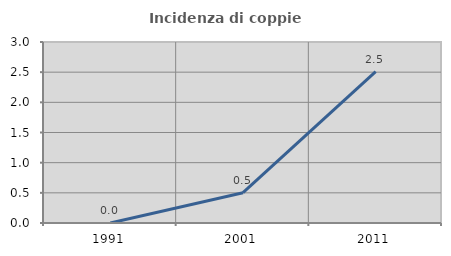
| Category | Incidenza di coppie miste |
|---|---|
| 1991.0 | 0 |
| 2001.0 | 0.503 |
| 2011.0 | 2.508 |